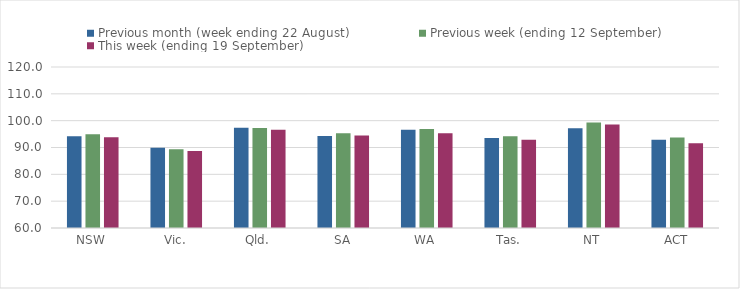
| Category | Previous month (week ending 22 August) | Previous week (ending 12 September) | This week (ending 19 September) |
|---|---|---|---|
| NSW | 94.2 | 94.94 | 93.78 |
| Vic. | 89.94 | 89.36 | 88.67 |
| Qld. | 97.35 | 97.3 | 96.64 |
| SA | 94.33 | 95.3 | 94.44 |
| WA | 96.65 | 96.9 | 95.28 |
| Tas. | 93.58 | 94.16 | 92.9 |
| NT | 97.22 | 99.32 | 98.58 |
| ACT | 92.91 | 93.76 | 91.56 |